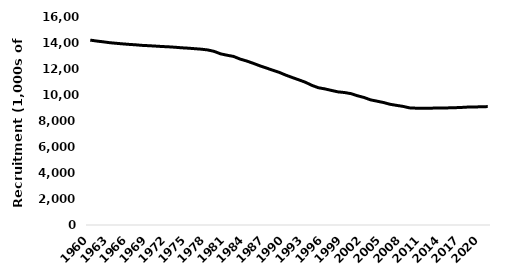
| Category | Age-0 Recruits (1,000s pups) |
|---|---|
| 1960.0 | 14222 |
| 1961.0 | 14149 |
| 1962.0 | 14090 |
| 1963.0 | 14023 |
| 1964.0 | 13976 |
| 1965.0 | 13932 |
| 1966.0 | 13892 |
| 1967.0 | 13859 |
| 1968.0 | 13816 |
| 1969.0 | 13792 |
| 1970.0 | 13762 |
| 1971.0 | 13730 |
| 1972.0 | 13707 |
| 1973.0 | 13674 |
| 1974.0 | 13632 |
| 1975.0 | 13603 |
| 1976.0 | 13564 |
| 1977.0 | 13526 |
| 1978.0 | 13468 |
| 1979.0 | 13358 |
| 1980.0 | 13166 |
| 1981.0 | 13058 |
| 1982.0 | 12966 |
| 1983.0 | 12763 |
| 1984.0 | 12616 |
| 1985.0 | 12440 |
| 1986.0 | 12251 |
| 1987.0 | 12082 |
| 1988.0 | 11905 |
| 1989.0 | 11741 |
| 1990.0 | 11530 |
| 1991.0 | 11346 |
| 1992.0 | 11167 |
| 1993.0 | 10984 |
| 1994.0 | 10745 |
| 1995.0 | 10559 |
| 1996.0 | 10470 |
| 1997.0 | 10354 |
| 1998.0 | 10242 |
| 1999.0 | 10191 |
| 2000.0 | 10106 |
| 2001.0 | 9943 |
| 2002.0 | 9811 |
| 2003.0 | 9629 |
| 2004.0 | 9526 |
| 2005.0 | 9424 |
| 2006.0 | 9286 |
| 2007.0 | 9203 |
| 2008.0 | 9124 |
| 2009.0 | 9010 |
| 2010.0 | 8986 |
| 2011.0 | 8984 |
| 2012.0 | 8984 |
| 2013.0 | 8995 |
| 2014.0 | 8999 |
| 2015.0 | 9010 |
| 2016.0 | 9024 |
| 2017.0 | 9044 |
| 2018.0 | 9074 |
| 2019.0 | 9081 |
| 2020.0 | 9092 |
| 2021.0 | 9109 |